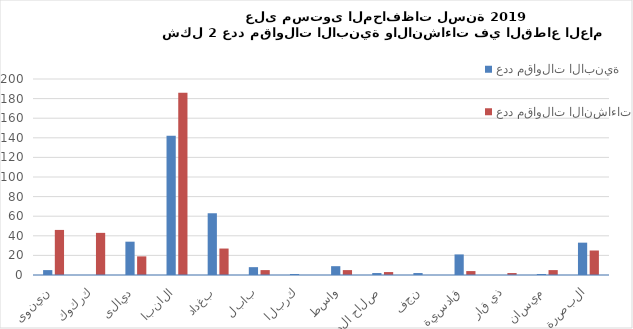
| Category | عدد مقاولات الابنية  | عدد مقاولات الانشاءات  |
|---|---|---|
| نينوى | 5 | 46 |
| كركوك | 0 | 43 |
| ديالى | 34 | 19 |
| الانبار | 142 | 186 |
| بغداد | 63 | 27 |
| بابل | 8 | 5 |
| كربلاء | 1 | 0 |
| واسط | 9 | 5 |
| صلاح الدين | 2 | 3 |
| نجف | 2 | 0 |
| قادسية | 21 | 4 |
| ذي قار | 0 | 2 |
| ميسان | 1 | 5 |
| البصرة | 33 | 25 |